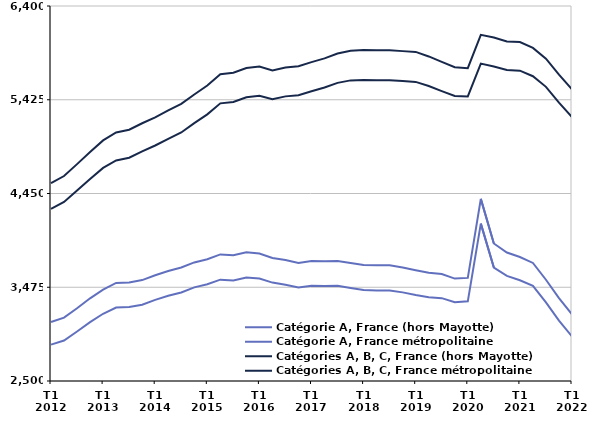
| Category | Catégorie A, France (hors Mayotte) | Catégorie A, France métropolitaine | Catégories A, B, C, France (hors Mayotte) | Catégories A, B, C, France métropolitaine |
|---|---|---|---|---|
| T1
2012 | 3113 | 2878 | 4557.2 | 4291 |
| T2
2012 | 3159 | 2921.5 | 4631.5 | 4361.6 |
| T3
2012 | 3256.7 | 3014.6 | 4755.6 | 4480 |
| T4
2012 | 3360.1 | 3112.1 | 4881.7 | 4599.7 |
| T1
2013 | 3450.5 | 3199.3 | 5002.3 | 4716.5 |
| T2
2013 | 3519.4 | 3263.5 | 5084.8 | 4794 |
| T3
2013 | 3525.6 | 3269.5 | 5113.2 | 4822.1 |
| T4
2013 | 3549.6 | 3292.6 | 5180.4 | 4887.5 |
| T1
2014 | 3600.3 | 3343.8 | 5242.6 | 4949.4 |
| T2
2014 | 3643.8 | 3385.7 | 5314 | 5018.7 |
| T3
2014 | 3680.3 | 3421.1 | 5381.5 | 5084.6 |
| T4
2014 | 3733 | 3473.8 | 5479.6 | 5181.7 |
| T1
2015 | 3766.4 | 3506.3 | 5572.6 | 5273.1 |
| T2
2015 | 3816.5 | 3554.1 | 5691.3 | 5387.7 |
| T3
2015 | 3807 | 3545.1 | 5706.6 | 5402.5 |
| T4
2015 | 3837.8 | 3577.3 | 5754.8 | 5451.4 |
| T1
2016 | 3825.5 | 3565.5 | 5769.9 | 5466.5 |
| T2
2016 | 3779.2 | 3523.4 | 5730 | 5430.8 |
| T3
2016 | 3757.5 | 3501.9 | 5760 | 5460.1 |
| T4
2016 | 3727.7 | 3471.4 | 5773.5 | 5472.1 |
| T1
2017 | 3747.7 | 3490.5 | 5816.2 | 5513.8 |
| T2
2017 | 3744.5 | 3488.6 | 5855.6 | 5553.2 |
| T3
2017 | 3746.7 | 3489.7 | 5905.6 | 5600.8 |
| T4
2017 | 3727.1 | 3467.9 | 5934.8 | 5626.4 |
| T1
2018 | 3706.9 | 3446.5 | 5941.8 | 5631.4 |
| T2
2018 | 3703 | 3442.2 | 5939.3 | 5626.8 |
| T3
2018 | 3702.6 | 3442.3 | 5939.2 | 5626.8 |
| T4
2018 | 3680.6 | 3421.6 | 5930.7 | 5619 |
| T1
2019 | 3651.8 | 3393.7 | 5922.7 | 5610.7 |
| T2
2019 | 3625.1 | 3370.5 | 5875.5 | 5567.6 |
| T3
2019 | 3612.9 | 3361.8 | 5818.5 | 5514.6 |
| T4
2019 | 3564.9 | 3319 | 5763.1 | 5464.7 |
| T1
2020 | 3572.1 | 3328.5 | 5753.9 | 5459 |
| T2
2020 | 4394.2 | 4136.7 | 6100.6 | 5800.5 |
| T3
2020 | 3930.3 | 3680.5 | 6071.8 | 5770.7 |
| T4
2020 | 3836.3 | 3593.3 | 6030.4 | 5733.6 |
| T1
2021 | 3789.3 | 3548 | 6024.7 | 5727.8 |
| T2
2021 | 3727.7 | 3488.9 | 5964.2 | 5669.7 |
| T3
2021 | 3553 | 3317.3 | 5851.5 | 5559.2 |
| T4
2021 | 3361.9 | 3127.5 | 5685.4 | 5394.2 |
| T1
2022 | 3192.8 | 2962.8 | 5532.7 | 5244.2 |